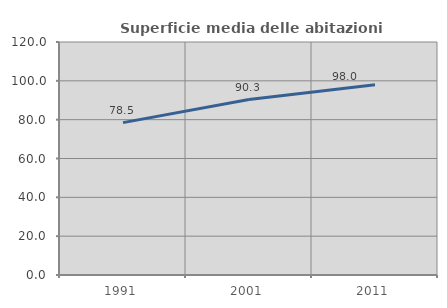
| Category | Superficie media delle abitazioni occupate |
|---|---|
| 1991.0 | 78.478 |
| 2001.0 | 90.343 |
| 2011.0 | 98.028 |